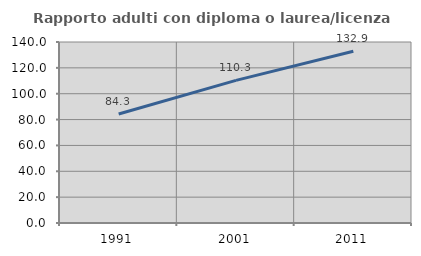
| Category | Rapporto adulti con diploma o laurea/licenza media  |
|---|---|
| 1991.0 | 84.302 |
| 2001.0 | 110.314 |
| 2011.0 | 132.877 |